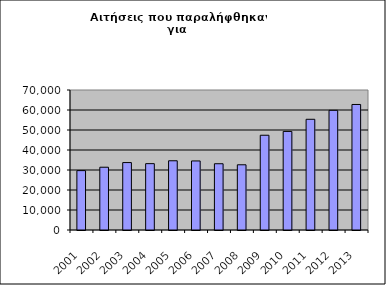
| Category | Series 1 |
|---|---|
| 2001.0 | 29694 |
| 2002.0 | 31386 |
| 2003.0 | 33712 |
| 2004.0 | 33179 |
| 2005.0 | 34612 |
| 2006.0 | 34527 |
| 2007.0 | 33131 |
| 2008.0 | 32607 |
| 2009.0 | 47377 |
| 2010.0 | 49282 |
| 2011.0 | 55358 |
| 2012.0 | 59832 |
| 2013.0 | 62763 |